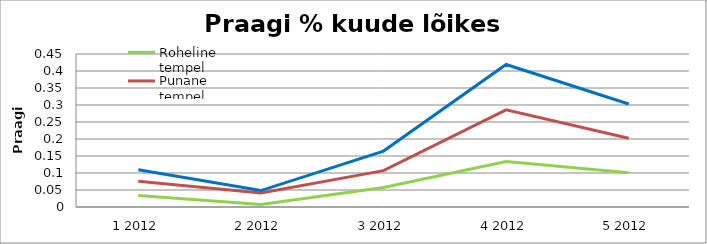
| Category | Roheline tempel | Punane tempel | Praak kokku |
|---|---|---|---|
| 1 2012 | 0.034 | 0.076 | 0.11 |
| 2 2012 | 0.007 | 0.041 | 0.048 |
| 3 2012 | 0.058 | 0.107 | 0.164 |
| 4 2012 | 0.134 | 0.286 | 0.419 |
| 5 2012 | 0.101 | 0.202 | 0.303 |